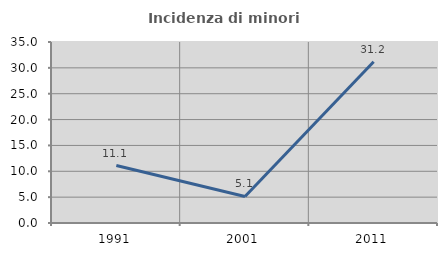
| Category | Incidenza di minori stranieri |
|---|---|
| 1991.0 | 11.111 |
| 2001.0 | 5.128 |
| 2011.0 | 31.188 |